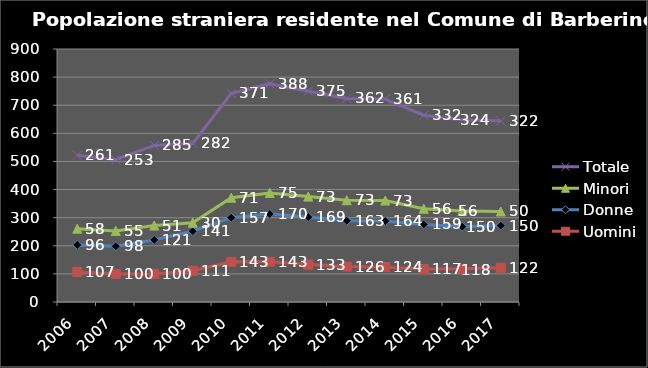
| Category | Uomini | Donne | Minori | Totale |
|---|---|---|---|---|
| 2006.0 | 107 | 96 | 58 | 261 |
| 2007.0 | 100 | 98 | 55 | 253 |
| 2008.0 | 100 | 121 | 51 | 285 |
| 2009.0 | 111 | 141 | 30 | 282 |
| 2010.0 | 143 | 157 | 71 | 371 |
| 2011.0 | 143 | 170 | 75 | 388 |
| 2012.0 | 133 | 169 | 73 | 375 |
| 2013.0 | 126 | 163 | 73 | 362 |
| 2014.0 | 124 | 164 | 73 | 361 |
| 2015.0 | 117 | 159 | 56 | 332 |
| 2016.0 | 118 | 150 | 56 | 324 |
| 2017.0 | 122 | 150 | 50 | 322 |